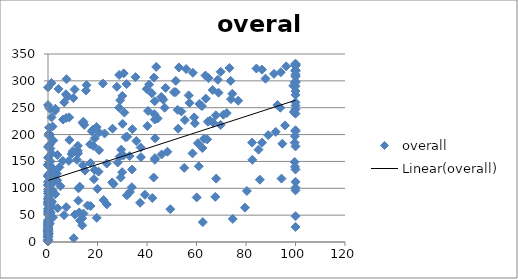
| Category | overall |
|---|---|
| 0.7637944637491397 | 248 |
| 100.0 | 297 |
| 43.28577315339446 | 193 |
| 7.236529135692021 | 275 |
| 1.445707354328586 | 232 |
| 42.69792205006192 | 120 |
| 58.40831869836269 | 165 |
| 94.68050716569088 | 183 |
| 0.0 | 1 |
| 0.117484187263444 | 145 |
| 19.998074286683693 | 99 |
| 20.438616009345274 | 131 |
| 1.4616813860334925 | 165 |
| 28.16789689667379 | 148 |
| 63.75061583795792 | 267 |
| 45.89784564393939 | 163 |
| 30.489223030532493 | 161 |
| 0.0544786983711327 | 32 |
| 0.034071236509632036 | 19 |
| 20.665035808768998 | 204 |
| 5.026916921286192 | 104 |
| 0.0 | 177 |
| 47.12103898999471 | 250 |
| 3.6972350212764327 | 115 |
| 37.200230108222776 | 73 |
| 0.14073217443447084 | 84 |
| 6.507528996194534 | 50 |
| 12.62384818512923 | 55 |
| 67.95545441486668 | 118 |
| 100.0 | 178 |
| 0.0 | 36 |
| 30.031276490017834 | 272 |
| 1.207139483150513 | 71 |
| 0.0 | 122 |
| 48.25793075548663 | 168 |
| 1.0562570202860893 | 92 |
| 30.59092615983341 | 314 |
| 2.020527084027722 | 46 |
| 2.9607863193818056 | 248 |
| 6.0886474887681885 | 228 |
| 2.8663936240867836 | 128 |
| 29.59008926944799 | 172 |
| 0.0 | 21 |
| 0.0 | 9 |
| 33.929886900377 | 135 |
| 18.569516442722236 | 117 |
| 28.76568102583458 | 311 |
| 0.6693054225278974 | 181 |
| 53.888083105503426 | 243 |
| 25.9205375782881 | 111 |
| 23.760054046474867 | 146 |
| 0.0 | 72 |
| 43.11820688293243 | 262 |
| 50.87952273166737 | 279 |
| 40.42715602707038 | 244 |
| 1.855845457582845 | 96 |
| 100.0 | 318 |
| 46.59888701026772 | 265 |
| 39.89136934422962 | 285 |
| 1.3971654949224417 | 296 |
| 0.0 | 288 |
| 33.09534052020264 | 93 |
| 100.0 | 112 |
| 7.370596524189761 | 65 |
| 92.01860636485056 | 205 |
| 100.0 | 331 |
| 0.746883281637099 | 34 |
| 86.46459367650901 | 321 |
| 0.0 | 74 |
| 0.0 | 69 |
| 35.67288416281705 | 188 |
| 12.071188799738005 | 179 |
| 12.322655794991263 | 100 |
| 94.34807406067857 | 118 |
| 0.1681270734169912 | 16 |
| 100.0 | 308 |
| 17.02594998274185 | 182 |
| 62.5593415007657 | 37 |
| 0.0 | 62 |
| 74.63444292445661 | 43 |
| 0.0 | 27 |
| 100.0 | 101 |
| 73.80669352586861 | 300 |
| 73.29371532427778 | 324 |
| 67.82373688791169 | 236 |
| 31.992104935969166 | 196 |
| 100.0 | 135 |
| 60.072694942733115 | 83 |
| 70.86727207331086 | 237 |
| 37.457425971845666 | 176 |
| 0.0 | 157 |
| 31.867045913500785 | 87 |
| 100.0 | 332 |
| 15.57400562244388 | 292 |
| 0.12833309567945245 | 60 |
| 35.37158750393192 | 307 |
| 3.8021058275127704 | 162 |
| 10.000454153231301 | 169 |
| 3.8996361540401314 | 63 |
| 1.6071758831144811 | 75 |
| 85.05961340883569 | 172 |
| 100.0 | 239 |
| 95.78769903215735 | 217 |
| 41.93909752865476 | 277 |
| 10.233538760947129 | 268 |
| 18.348960712142787 | 179 |
| 0.2691300552807681 | 42 |
| 0.0 | 23 |
| 19.701186465504612 | 45 |
| 26.530140634284834 | 108 |
| 0.0 | 10 |
| 29.146506826096335 | 264 |
| 0.0 | 4 |
| 3.618902568007784 | 127 |
| 100.0 | 290 |
| 0.0 | 14 |
| 93.86896046852124 | 250 |
| 0.0 | 90 |
| 0.0 | 144 |
| 43.735383883625985 | 326 |
| 0.08556718474293587 | 142 |
| 30.841110327768952 | 241 |
| 2.8453450065436163 | 244 |
| 0.0 | 112 |
| 22.462731935370623 | 78 |
| 0.7767569396221712 | 200 |
| 66.52737365018207 | 283 |
| 40.86087592323751 | 293 |
| 66.76490946033448 | 222 |
| 2.9496008539294354 | 89 |
| 28.993841063562613 | 159 |
| 60.55036115405695 | 184 |
| 0.0 | 51 |
| 99.79281283667915 | 140 |
| 10.734324546648823 | 284 |
| 0.10506265321636928 | 125 |
| 85.60923658204315 | 116 |
| 100.0 | 48 |
| 0.0 | 2 |
| 0.0 | 81 |
| 29.35066839365576 | 120 |
| 69.75733108557739 | 218 |
| 0.0 | 33 |
| 0.2576215885531727 | 201 |
| 12.830539127034557 | 103 |
| 1.427262100844801 | 66 |
| 0.0 | 4 |
| 28.767941244523392 | 250 |
| 12.265823598996596 | 77 |
| 0.21238394734305896 | 24 |
| 64.59139749970183 | 224 |
| 0.0 | 13 |
| 59.343572570864325 | 221 |
| 0.0 | 39 |
| 0.0 | 94 |
| 0.0 | 12 |
| 32.98007813343118 | 160 |
| 100.0 | 96 |
| 52.90693645624004 | 325 |
| 0.024936704029313347 | 18 |
| 14.643333435136263 | 218 |
| 10.405720079997756 | 7 |
| 100.0 | 208 |
| 100.0 | 260 |
| 0.0 | 57 |
| 100.0 | 320 |
| 99.67275984016901 | 149 |
| 100.0 | 206 |
| 0.3082920177564345 | 198 |
| 10.865057923455012 | 51 |
| 47.506692398680194 | 287 |
| 45.91678049184302 | 269 |
| 63.6118801438876 | 310 |
| 1.828697010005205 | 215 |
| 19.65760882914009 | 214 |
| 0.0 | 8 |
| 64.84256243213899 | 305 |
| 100.0 | 312 |
| 73.91385168279409 | 266 |
| 12.131049831654101 | 165 |
| 31.32056106739651 | 195 |
| 80.37682114279035 | 95 |
| 52.383851078034795 | 246 |
| 100.0 | 274 |
| 55.04359184020219 | 138 |
| 8.625588951222825 | 190 |
| 76.85391085758484 | 263 |
| 57.179339995079836 | 259 |
| 0.8091830956915633 | 47 |
| 79.55839991658085 | 64 |
| 0.2318945455442532 | 107 |
| 0.0 | 75 |
| 2.013574850450118 | 137 |
| 0.0 | 80 |
| 8.409823180905192 | 151 |
| 0.9414389291689905 | 129 |
| 14.298841300791143 | 224 |
| 12.903081016960021 | 40 |
| 0.0 | 38 |
| 4.59032791162912 | 139 |
| 0.0 | 20 |
| 6.534722222222222 | 260 |
| 84.22157987444108 | 323 |
| 0.3395301070986943 | 59 |
| 0.0 | 26 |
| 44.315201850747556 | 230 |
| 2.4613979217681465 | 126 |
| 4.259108928838833 | 285 |
| 92.6770953034066 | 255 |
| 0.0 | 255 |
| 100.0 | 319 |
| 1.599050685237961 | 112 |
| 22.858379369160666 | 202 |
| 15.33829098042794 | 282 |
| 51.65038319780027 | 300 |
| 12.059102179040092 | 170 |
| 26.09302112869295 | 211 |
| 7.373336745138179 | 231 |
| 56.837898246012806 | 273 |
| 0.0 | 24 |
| 100.0 | 299 |
| 100.0 | 328 |
| 0.45647091502511516 | 213 |
| 0.0 | 30 |
| 45.74674164488161 | 270 |
| 65.44043358795925 | 226 |
| 11.682421532278607 | 153 |
| 100.0 | 247 |
| 69.76480485752954 | 317 |
| 1.8371987444152391 | 109 |
| 37.542201215395 | 158 |
| 74.4524388393503 | 276 |
| 0.259039124129201 | 15 |
| 9.517627184913756 | 164 |
| 58.52766272904546 | 315 |
| 82.5569939811893 | 153 |
| 43.20443612059785 | 156 |
| 18.860218819093532 | 193 |
| 96.243896484375 | 327 |
| 100.0 | 28 |
| 67.5933496865631 | 84 |
| 100.0 | 329 |
| 88.96346751463467 | 199 |
| 99.6648666422167 | 185 |
| 99.12840782405999 | 291 |
| 7.943114810960806 | 271 |
| 72.21828443484655 | 240 |
| 40.13803637597941 | 216 |
| 0.19047245022189058 | 105 |
| 0.0 | 21 |
| 0.0 | 54 |
| 0.0 | 2 |
| 0.9650608143253981 | 174 |
| 31.77206759289376 | 294 |
| 62.37950640934194 | 175 |
| 23.77052427821894 | 70 |
| 43.168981961434795 | 228 |
| 64.31785533209397 | 191 |
| 0.4167503514762001 | 49 |
| 8.575526215885604 | 232 |
| 14.076459879568686 | 143 |
| 0.39193845360953283 | 58 |
| 99.69889505237971 | 297 |
| 51.61945572931159 | 279 |
| 82.45973518558715 | 185 |
| 0.5979105200895084 | 90 |
| 22.168040607111234 | 295 |
| 0.2494763219744745 | 78 |
| 49.42907208932719 | 61 |
| 13.800819553798489 | 44 |
| 1.0957424324260854 | 55 |
| 0.13304305757135945 | 16 |
| 55.80836364093981 | 322 |
| 43.175152510558426 | 153 |
| 91.30743919175886 | 313 |
| 15.980182753434526 | 68 |
| 60.91115680121199 | 141 |
| 52.58206565252201 | 211 |
| 55.32204098703472 | 227 |
| 5.968688845401174 | 151 |
| 7.4744694720069536 | 303 |
| 13.85046977424252 | 31 |
| 63.03960009663092 | 192 |
| 14.928187681839871 | 133 |
| 100.0 | 309 |
| 0.0 | 4 |
| 0.363430248066151 | 124 |
| 42.14543916320566 | 82 |
| 100.0 | 254 |
| 61.17090827221323 | 257 |
| 29.964402875689256 | 130 |
| 1.0231441444643203 | 150 |
| 0.0 | 34 |
| 0.0 | 11 |
| 17.211780530825234 | 147 |
| 30.135321865916996 | 220 |
| 0.0 | 106 |
| 39.177862799181426 | 88 |
| 68.89536896026581 | 278 |
| 87.8876017465751 | 304 |
| 33.86003272962306 | 102 |
| 14.038794916245243 | 222 |
| 42.79997788436286 | 306 |
| 100.0 | 330 |
| 94.04959394550521 | 316 |
| 62.195301840174054 | 253 |
| 99.76851560632556 | 197 |
| 86.48319966451749 | 185 |
| 100.0 | 281 |
| 0.0 | 29 |
| 20.65757213805243 | 171 |
| 14.342671770411108 | 53 |
| 68.61832050494743 | 302 |
| 59.052753320399944 | 232 |
| 18.11976558816265 | 209 |
| 18.83923824409242 | 134 |
| 2.134727501755716 | 189 |
| 17.670824403296017 | 206 |
| 0.0 | 123 |
| 0.13719185423365488 | 41 |
| 0.0 | 98 |
| 99.33074246863963 | 242 |
| 34.08380160497406 | 210 |
| 27.807831136964367 | 289 |
| 42.98233884323023 | 238 |
| 17.22379228119756 | 67 |